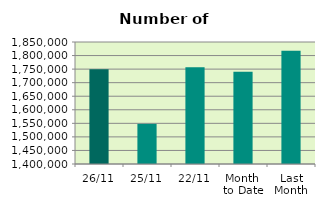
| Category | Series 0 |
|---|---|
| 26/11 | 1749218 |
| 25/11 | 1548110 |
| 22/11 | 1757090 |
| Month 
to Date | 1740399.444 |
| Last
Month | 1817802.609 |